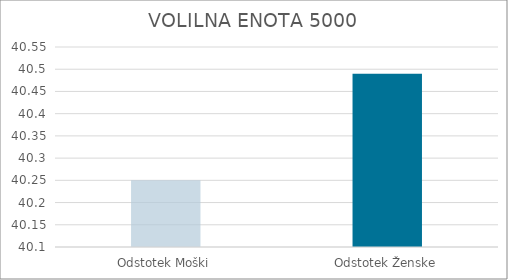
| Category | Series 0 |
|---|---|
| Odstotek Moški | 40.25 |
| Odstotek Ženske | 40.49 |